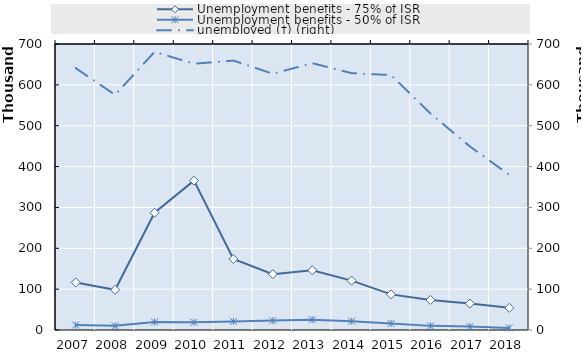
| Category | Series 4 | Series 5 | Series 6 | Series 7 | Series 8 | Series 9 | Series 10 | Series 11 | Series 12 | Series 13 | Series 14 | Series 15 | Series 16 | Series 17 | Series 18 | Series 19 | Unemployment benefits - 75% of ISR | Unemployment benefits - 50% of ISR |
|---|---|---|---|---|---|---|---|---|---|---|---|---|---|---|---|---|---|---|
| 2007.0 |  |  |  |  |  |  |  |  |  |  |  |  |  |  |  |  | 116463 | 12063 |
| 2008.0 |  |  |  |  |  |  |  |  |  |  |  |  |  |  |  |  | 98393 | 10144 |
| 2009.0 |  |  |  |  |  |  |  |  |  |  |  |  |  |  |  |  | 287040 | 19719 |
| 2010.0 |  |  |  |  |  |  |  |  |  |  |  |  |  |  |  |  | 365511 | 18817 |
| 2011.0 |  |  |  |  |  |  |  |  |  |  |  |  |  |  |  |  | 173831 | 20990 |
| 2012.0 |  |  |  |  |  |  |  |  |  |  |  |  |  |  |  |  | 136592 | 23003 |
| 2013.0 |  |  |  |  |  |  |  |  |  |  |  |  |  |  |  |  | 146356 | 25184.5 |
| 2014.0 |  |  |  |  |  |  |  |  |  |  |  |  |  |  |  |  | 120916.667 | 21557.25 |
| 2015.0 |  |  |  |  |  |  |  |  |  |  |  |  |  |  |  |  | 87168.917 | 16090.917 |
| 2016.0 |  |  |  |  |  |  |  |  |  |  |  |  |  |  |  |  | 73599.917 | 10097.583 |
| 2017.0 |  |  |  |  |  |  |  |  |  |  |  |  |  |  |  |  | 64730 | 8335.5 |
| 2018.0 |  |  |  |  |  |  |  |  |  |  |  |  |  |  |  |  | 54230 | 4949 |